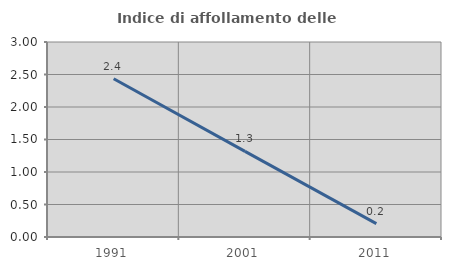
| Category | Indice di affollamento delle abitazioni  |
|---|---|
| 1991.0 | 2.434 |
| 2001.0 | 1.318 |
| 2011.0 | 0.206 |